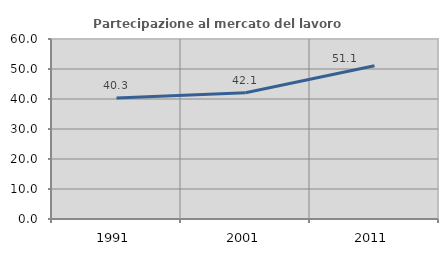
| Category | Partecipazione al mercato del lavoro  femminile |
|---|---|
| 1991.0 | 40.299 |
| 2001.0 | 42.053 |
| 2011.0 | 51.094 |